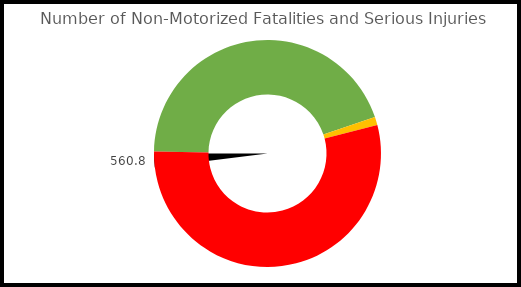
| Category | Pointer |
|---|---|
| 0 | 560.8 |
| 1 | 11.216 |
| 2 | 831.984 |